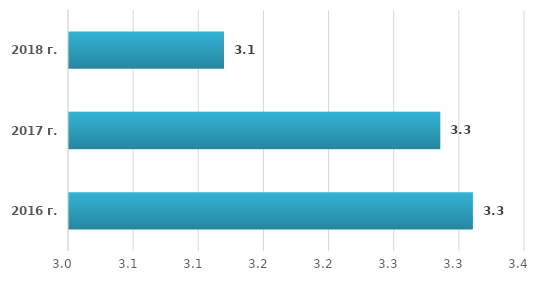
| Category | Series 0 |
|---|---|
| 2016 г. | 3.31 |
| 2017 г. | 3.285 |
| 2018 г. | 3.119 |